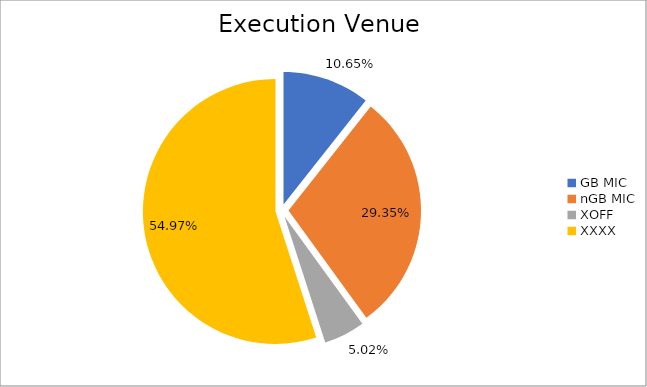
| Category | Series 0 |
|---|---|
| GB MIC | 1037846.292 |
| nGB MIC | 2860368.191 |
| XOFF | 489364.375 |
| XXXX | 5357161.833 |